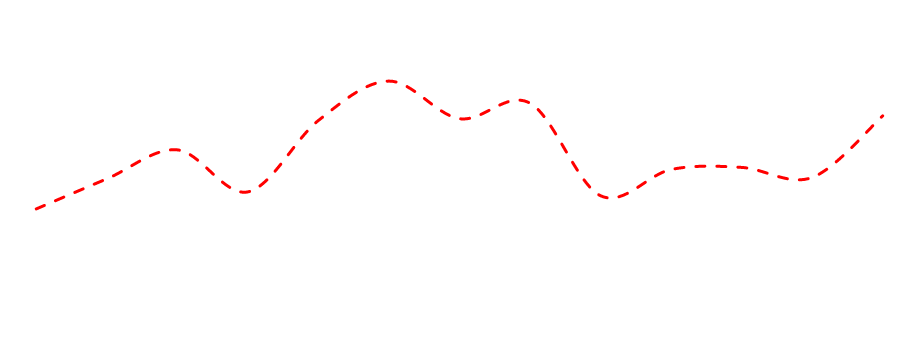
| Category | Series 0 |
|---|---|
| 0 | 23458.719 |
| 1 | 24252.704 |
| 2 | 25018.477 |
| 3 | 23908.736 |
| 4 | 25795.493 |
| 5 | 26834.71 |
| 6 | 25842.187 |
| 7 | 26253.007 |
| 8 | 23806.433 |
| 9 | 24500.298 |
| 10 | 24555.126 |
| 11 | 24289.103 |
| 12 | 25916.072 |